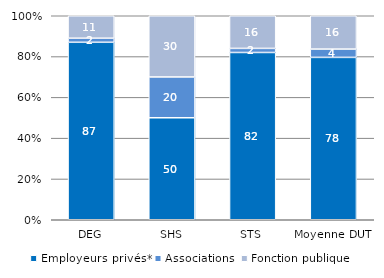
| Category | Employeurs privés* | Associations | Fonction publique |
|---|---|---|---|
| DEG | 87 | 2 | 11 |
| SHS | 50 | 20 | 30 |
| STS | 82 | 2 | 16 |
| Moyenne DUT | 78 | 4 | 16 |